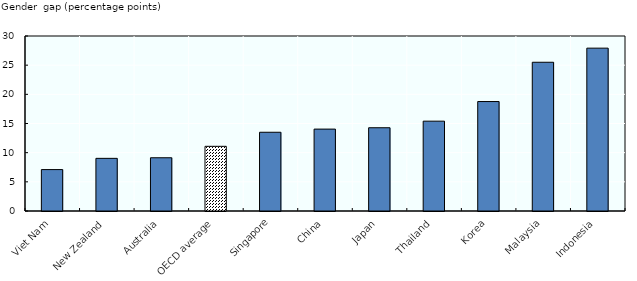
| Category | Gender Gap in Employment Rates |
|---|---|
| Viet Nam | 7.1 |
| New Zealand | 9.026 |
| Australia | 9.127 |
| OECD average | 11.088 |
| Singapore | 13.5 |
| China | 14.038 |
| Japan | 14.273 |
| Thailand | 15.4 |
| Korea | 18.764 |
| Malaysia | 25.5 |
| Indonesia | 27.918 |